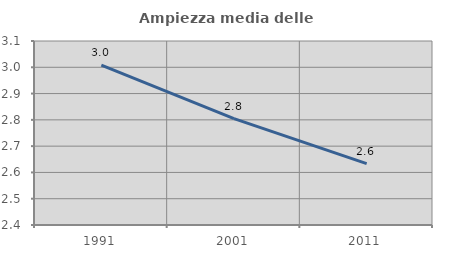
| Category | Ampiezza media delle famiglie |
|---|---|
| 1991.0 | 3.009 |
| 2001.0 | 2.805 |
| 2011.0 | 2.634 |